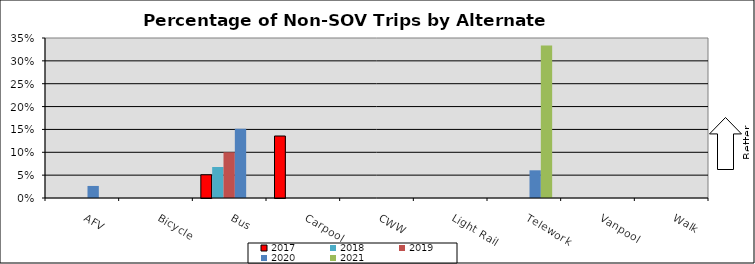
| Category | 2017 | 2018 | 2019 | 2020 | 2021 |
|---|---|---|---|---|---|
| AFV | 0 | 0 | 0 | 0.026 | 0 |
| Bicycle | 0 | 0 | 0 | 0 | 0 |
| Bus | 0.051 | 0.068 | 0.1 | 0.152 | 0 |
| Carpool | 0.136 | 0 | 0 | 0 | 0 |
| CWW | 0 | 0 | 0 | 0 | 0 |
| Light Rail | 0 | 0 | 0 | 0 | 0 |
| Telework | 0 | 0 | 0 | 0.061 | 0.333 |
| Vanpool | 0 | 0 | 0 | 0 | 0 |
| Walk | 0 | 0 | 0 | 0 | 0 |